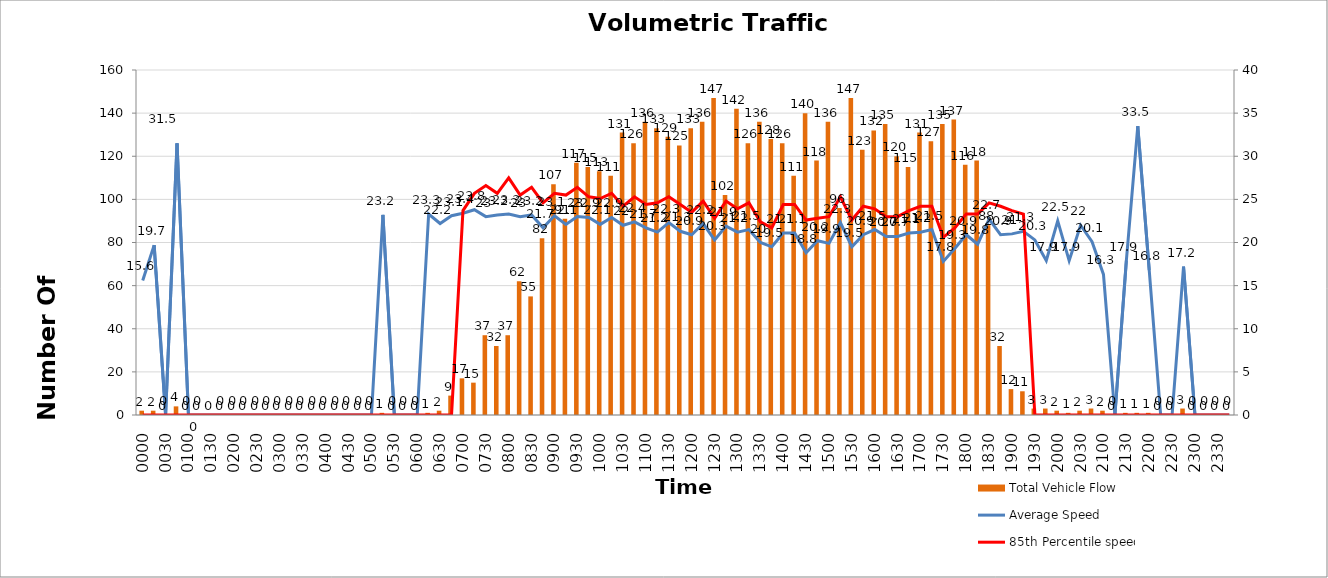
| Category | Total Vehicle Flow |
|---|---|
| 0000 | 2 |
| 0015 | 2 |
| 0030 | 0 |
| 0045 | 4 |
| 0100 | 0 |
| 0115 | 0 |
| 0130 | 0 |
| 0145 | 0 |
| 0200 | 0 |
| 0215 | 0 |
| 0230 | 0 |
| 0245 | 0 |
| 0300 | 0 |
| 0315 | 0 |
| 0330 | 0 |
| 0345 | 0 |
| 0400 | 0 |
| 0415 | 0 |
| 0430 | 0 |
| 0445 | 0 |
| 0500 | 0 |
| 0515 | 1 |
| 0530 | 0 |
| 0545 | 0 |
| 0600 | 0 |
| 0615 | 1 |
| 0630 | 2 |
| 0645 | 9 |
| 0700 | 17 |
| 0715 | 15 |
| 0730 | 37 |
| 0745 | 32 |
| 0800 | 37 |
| 0815 | 62 |
| 0830 | 55 |
| 0845 | 82 |
| 0900 | 107 |
| 0915 | 91 |
| 0930 | 117 |
| 0945 | 115 |
| 1000 | 113 |
| 1015 | 111 |
| 1030 | 131 |
| 1045 | 126 |
| 1100 | 136 |
| 1115 | 133 |
| 1130 | 129 |
| 1145 | 125 |
| 1200 | 133 |
| 1215 | 136 |
| 1230 | 147 |
| 1245 | 102 |
| 1300 | 142 |
| 1315 | 126 |
| 1330 | 136 |
| 1345 | 128 |
| 1400 | 126 |
| 1415 | 111 |
| 1430 | 140 |
| 1445 | 118 |
| 1500 | 136 |
| 1515 | 96 |
| 1530 | 147 |
| 1545 | 123 |
| 1600 | 132 |
| 1615 | 135 |
| 1630 | 120 |
| 1645 | 115 |
| 1700 | 131 |
| 1715 | 127 |
| 1730 | 135 |
| 1745 | 137 |
| 1800 | 116 |
| 1815 | 118 |
| 1830 | 88 |
| 1845 | 32 |
| 1900 | 12 |
| 1915 | 11 |
| 1930 | 3 |
| 1945 | 3 |
| 2000 | 2 |
| 2015 | 1 |
| 2030 | 2 |
| 2045 | 3 |
| 2100 | 2 |
| 2115 | 0 |
| 2130 | 1 |
| 2145 | 1 |
| 2200 | 1 |
| 2215 | 0 |
| 2230 | 0 |
| 2245 | 3 |
| 2300 | 0 |
| 2315 | 0 |
| 2330 | 0 |
| 2345 | 0 |